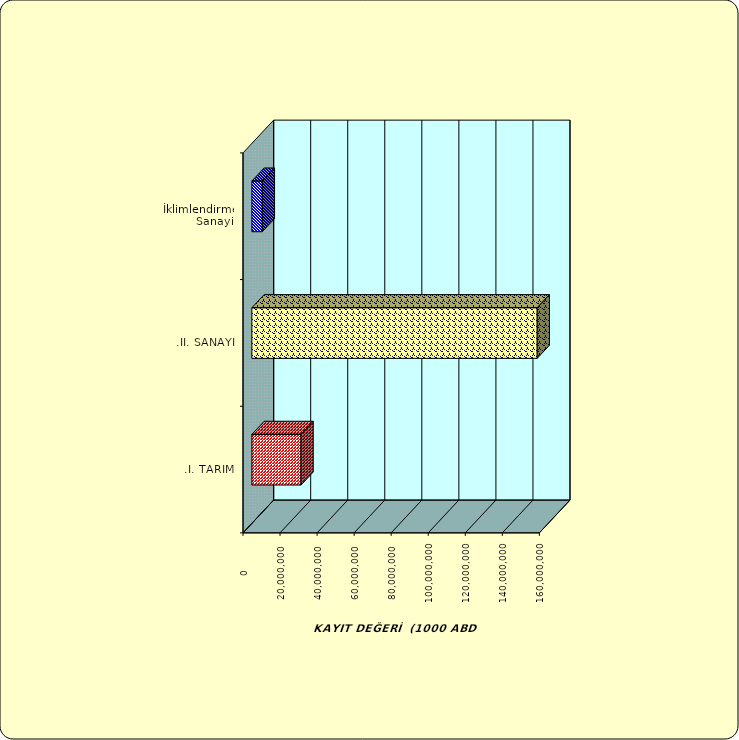
| Category | Series 0 |
|---|---|
| .I. TARIM | 26536406.235 |
| .II. SANAYİ | 154037108.701 |
|  İklimlendirme Sanayii | 5626116.38 |